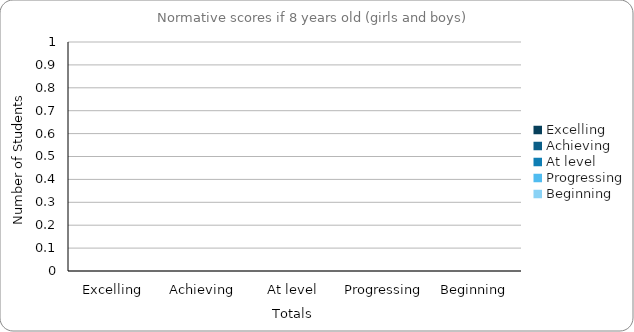
| Category | If 8 years old |
|---|---|
| Excelling | 0 |
| Achieving | 0 |
| At level | 0 |
| Progressing | 0 |
| Beginning | 0 |